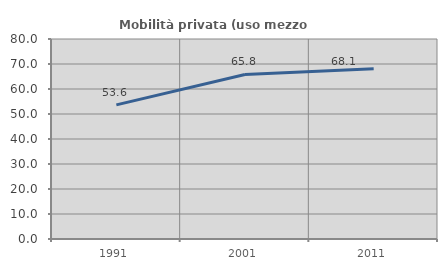
| Category | Mobilità privata (uso mezzo privato) |
|---|---|
| 1991.0 | 53.649 |
| 2001.0 | 65.813 |
| 2011.0 | 68.121 |